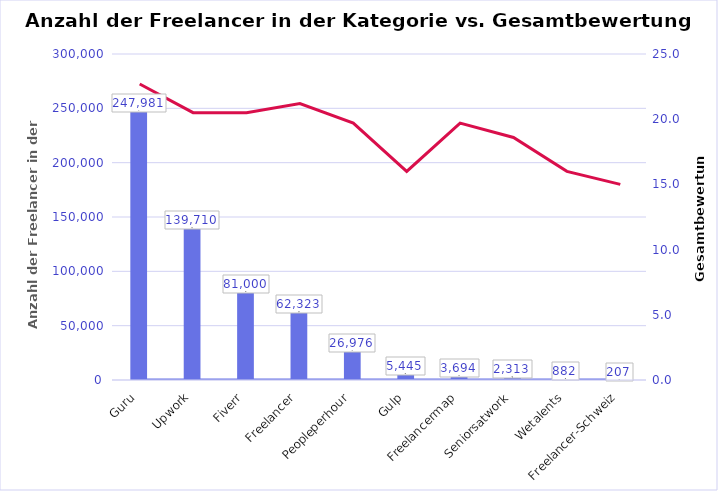
| Category | Freelancer Branche  |
|---|---|
| Guru | 247981 |
| Upwork | 139710 |
| Fiverr | 81000 |
| Freelancer | 62323 |
| Peopleperhour | 26976 |
| Gulp | 5445 |
| Freelancermap | 3694 |
| Seniorsatwork | 2313 |
| Wetalents | 882 |
| Freelancer-Schweiz | 207 |